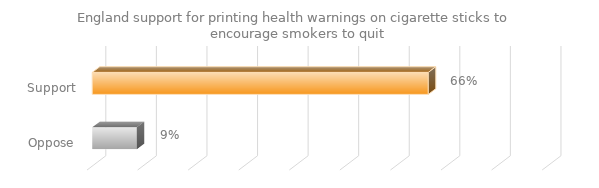
| Category | England support for printing health warnings on cigarette sticks to encourage smokers to quit |
|---|---|
| Support | 0.665 |
| Oppose | 0.088 |